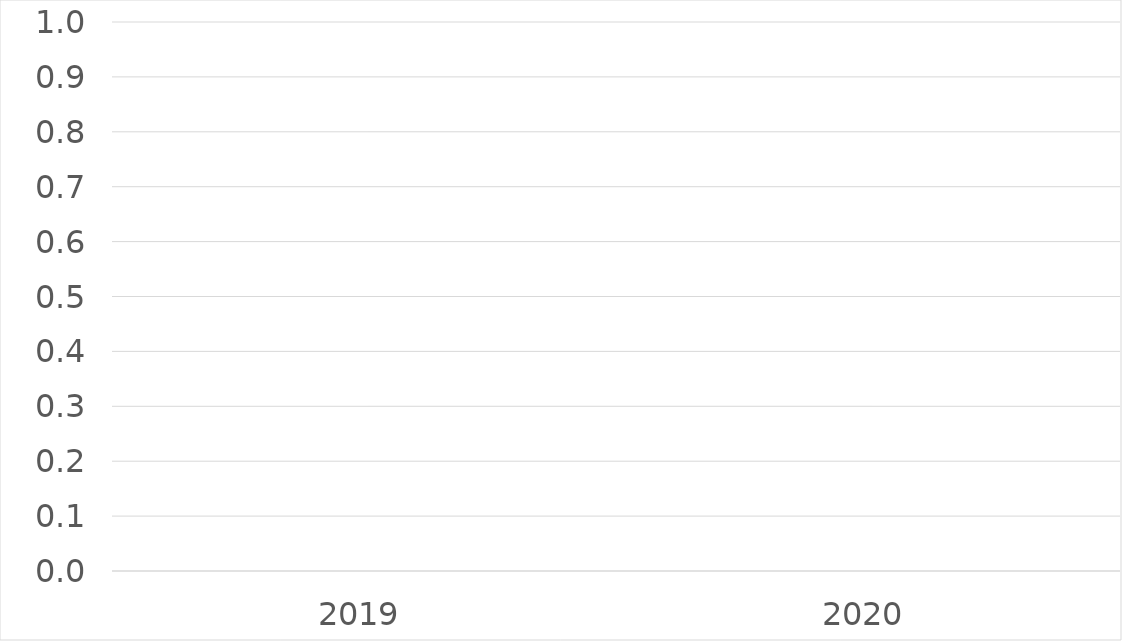
| Category | Series 0 |
|---|---|
| 2019 | 0 |
| 2020 | 0 |